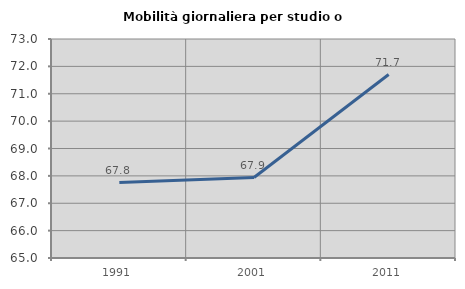
| Category | Mobilità giornaliera per studio o lavoro |
|---|---|
| 1991.0 | 67.754 |
| 2001.0 | 67.94 |
| 2011.0 | 71.701 |